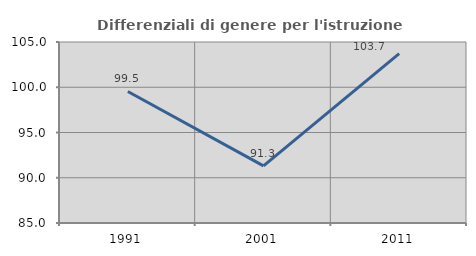
| Category | Differenziali di genere per l'istruzione superiore |
|---|---|
| 1991.0 | 99.532 |
| 2001.0 | 91.317 |
| 2011.0 | 103.709 |